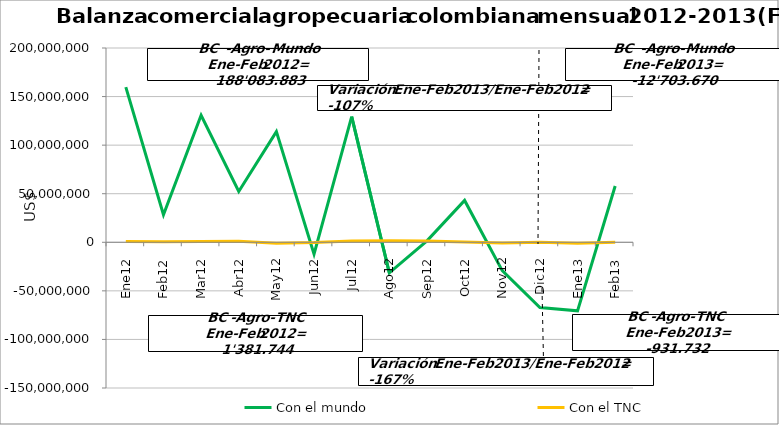
| Category | Con el mundo | Con el TNC |
|---|---|---|
| 0 | 159718841.64 | 711571.68 |
| 1 | 28365041.12 | 670172.25 |
| 2 | 130703974.8 | 774778.87 |
| 3 | 52247918.23 | 1039656.04 |
| 4 | 113869717.7 | -971305.11 |
| 5 | -12237480.38 | -346950.46 |
| 6 | 129307528.98 | 1195651.46 |
| 7 | -31469442.96 | 1656514.2 |
| 8 | 1432914.69 | 1289437.67 |
| 9 | 43090007.69 | 166942.76 |
| 10 | -29233824.97 | -665537.44 |
| 11 | -67196777.37 | -48965.82 |
| 12 | -70591672.64 | -877532.59 |
| 13 | 57888002.76 | -54199.87 |